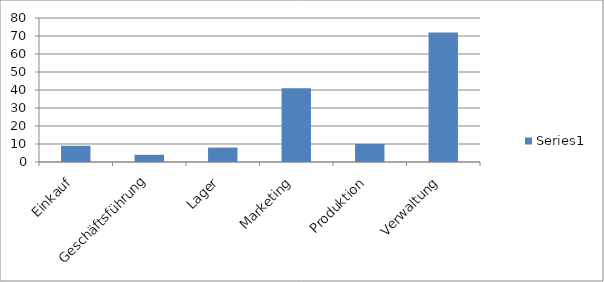
| Category | Series 0 |
|---|---|
| Einkauf | 9 |
| Geschäftsführung | 4 |
| Lager | 8 |
| Marketing | 41 |
| Produktion | 10 |
| Verwaltung | 72 |